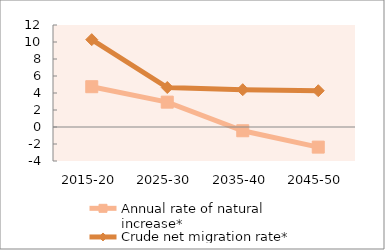
| Category | Annual rate of natural increase* | Crude net migration rate* |
|---|---|---|
| 2015-20 | 4.74 | 10.277 |
| 2025-30 | 2.924 | 4.647 |
| 2035-40 | -0.443 | 4.388 |
| 2045-50 | -2.366 | 4.267 |